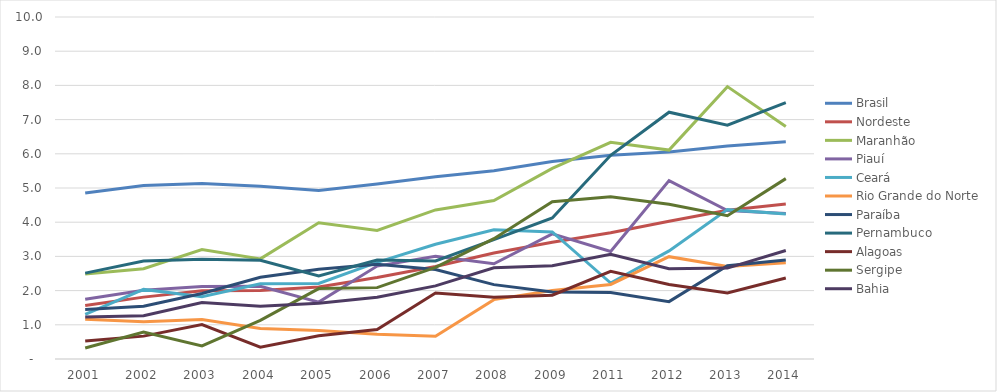
| Category | Brasil | Nordeste | Maranhão | Piauí | Ceará | Rio Grande do Norte | Paraíba | Pernambuco | Alagoas | Sergipe | Bahia |
|---|---|---|---|---|---|---|---|---|---|---|---|
| 2001.0 | 4.852 | 1.566 | 2.488 | 1.747 | 1.305 | 1.164 | 1.448 | 2.511 | 0.525 | 0.323 | 1.225 |
| 2002.0 | 5.076 | 1.809 | 2.64 | 2.011 | 2.035 | 1.086 | 1.543 | 2.867 | 0.669 | 0.788 | 1.263 |
| 2003.0 | 5.133 | 1.998 | 3.199 | 2.118 | 1.822 | 1.157 | 1.914 | 2.92 | 1.009 | 0.385 | 1.653 |
| 2004.0 | 5.049 | 2 | 2.928 | 2.127 | 2.2 | 0.895 | 2.391 | 2.889 | 0.347 | 1.128 | 1.543 |
| 2005.0 | 4.929 | 2.105 | 3.981 | 1.664 | 2.208 | 0.83 | 2.622 | 2.429 | 0.681 | 2.059 | 1.627 |
| 2006.0 | 5.12 | 2.382 | 3.76 | 2.717 | 2.827 | 0.722 | 2.77 | 2.896 | 0.86 | 2.087 | 1.807 |
| 2007.0 | 5.326 | 2.705 | 4.359 | 3.004 | 3.355 | 0.664 | 2.617 | 2.868 | 1.927 | 2.677 | 2.137 |
| 2008.0 | 5.504 | 3.1 | 4.635 | 2.785 | 3.781 | 1.736 | 2.174 | 3.489 | 1.804 | 3.519 | 2.668 |
| 2009.0 | 5.773 | 3.414 | 5.572 | 3.658 | 3.715 | 2.003 | 1.962 | 4.123 | 1.867 | 4.597 | 2.724 |
| 2011.0 | 5.957 | 3.691 | 6.337 | 3.143 | 2.221 | 2.18 | 1.947 | 5.958 | 2.563 | 4.743 | 3.064 |
| 2012.0 | 6.051 | 4.025 | 6.109 | 5.217 | 3.161 | 2.992 | 1.678 | 7.216 | 2.177 | 4.524 | 2.637 |
| 2013.0 | 6.226 | 4.35 | 7.964 | 4.341 | 4.367 | 2.704 | 2.727 | 6.837 | 1.931 | 4.188 | 2.658 |
| 2014.0 | 6.349 | 4.532 | 6.797 | 4.252 | 4.241 | 2.815 | 2.898 | 7.495 | 2.368 | 5.274 | 3.173 |